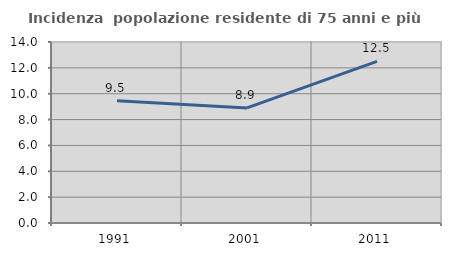
| Category | Incidenza  popolazione residente di 75 anni e più |
|---|---|
| 1991.0 | 9.465 |
| 2001.0 | 8.901 |
| 2011.0 | 12.5 |